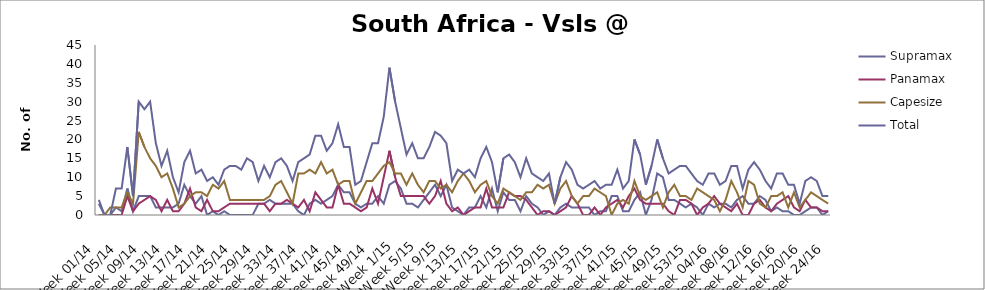
| Category | Supramax | Panamax | Capesize | Total |
|---|---|---|---|---|
| Week 01/14 | 3 | 0 | 0 | 4 |
| Week 02/14 | 0 | 0 | 0 | 0 |
| Week 03/14 | 0 | 0 | 2 | 0 |
| Week 04/14 | 2 | 0 | 2 | 7 |
| Week 05/14 | 1 | 0 | 2 | 7 |
| Week 06/14 | 7 | 5 | 6 | 18 |
| Week 07/14 | 1 | 1 | 3 | 5 |
| Week 08/14 | 5 | 3 | 22 | 30 |
| Week 09/14 | 5 | 4 | 18 | 28 |
| Week 10/14 | 5 | 5 | 15 | 30 |
| Week 11/14 | 2 | 4 | 13 | 19 |
| Week 12/14 | 2 | 1 | 10 | 13 |
| Week 13/14 | 2 | 4 | 11 | 17 |
| Week 14/14 | 2 | 1 | 7 | 10 |
| Week 15/14 | 3 | 1 | 2 | 6 |
| Week 16/14 | 8 | 3 | 3 | 14 |
| Week 17/14 | 5 | 7 | 5 | 17 |
| Week 18/14 | 3 | 2 | 6 | 11 |
| Week 19/14 | 5 | 1 | 6 | 12 |
| Week 20/14 | 0 | 4 | 5 | 9 |
| Week 21/14 | 1 | 1 | 8 | 10 |
| Week 22/14 | 0 | 1 | 7 | 8 |
| Week 23/14 | 1 | 2 | 9 | 12 |
| Week 24/14 | 0 | 3 | 4 | 13 |
| Week 25/14 | 0 | 3 | 4 | 13 |
| Week 26/14 | 0 | 3 | 4 | 12 |
| Week 27/14 | 0 | 3 | 4 | 15 |
| Week 28/14 | 0 | 3 | 4 | 14 |
| Week 29/14 | 3 | 3 | 4 | 9 |
| Week 30/14 | 3 | 3 | 4 | 13 |
| Week 31/14 | 4 | 1 | 5 | 10 |
| Week 32/14 | 3 | 3 | 8 | 14 |
| Week 33/14 | 3 | 3 | 9 | 15 |
| Week 34/14 | 3 | 4 | 6 | 13 |
| Week 35/14 | 3 | 3 | 3 | 9 |
| Week 36/14 | 1 | 2 | 11 | 14 |
| Week 37/14 | 0 | 4 | 11 | 15 |
| Week 38/14 | 3 | 1 | 12 | 16 |
| Week 39/14 | 4 | 6 | 11 | 21 |
| Week 40/14 | 3 | 4 | 14 | 21 |
| Week 41/14 | 4 | 2 | 11 | 17 |
| Week 42/14 | 5 | 2 | 12 | 19 |
| Week 43/14 | 8 | 8 | 8 | 24 |
| Week 44/14 | 6 | 3 | 9 | 18 |
| Week 45/14 | 6 | 3 | 9 | 18 |
| Week 46/14 | 3 | 2 | 3 | 8 |
| Week 47/14 | 2 | 1 | 6 | 9 |
| Week 48/14 | 3 | 2 | 9 | 14 |
| Week 49/14 | 3 | 7 | 9 | 19 |
| Week 50/14 | 5 | 3 | 11 | 19 |
| Week 51/14 | 3 | 10 | 13 | 26 |
| Week 52/14 | 8 | 17 | 14 | 39 |
| Week 1/15 | 9 | 10 | 11 | 30 |
| Week 2/15 | 7 | 5 | 11 | 23 |
| Week 3/15 | 3 | 5 | 8 | 16 |
| Week 4/15 | 3 | 5 | 11 | 19 |
| Week 5/15 | 2 | 5 | 8 | 15 |
| Week 6/15 | 4 | 5 | 6 | 15 |
| Week 7/15 | 6 | 3 | 9 | 18 |
| Week 8/15 | 8 | 5 | 9 | 22 |
| Week 9/15 | 5 | 9 | 7 | 21 |
| Week 10/15 | 8 | 3 | 8 | 19 |
| Week 11/15 | 2 | 1 | 6 | 9 |
| Week 12/15 | 1 | 2 | 9 | 12 |
| Week 13/15 | 0 | 0 | 11 | 11 |
| Week 14/15 | 2 | 1 | 9 | 12 |
| Week 15/15 | 2 | 2 | 6 | 10 |
| Week 16/15 | 5 | 2 | 8 | 15 |
| Week 17/15 | 2 | 7 | 9 | 18 |
| Week 18/15 | 7 | 2 | 5 | 14 |
| Week 19/15 | 1 | 2 | 3 | 6 |
| Week 20/15 | 6 | 2 | 7 | 15 |
| Week 21/15 | 4 | 6 | 6 | 16 |
| Week 22/15 | 4 | 5 | 5 | 14 |
| Week 23/15 | 1 | 5 | 4 | 10 |
| Week 24/15 | 5 | 4 | 6 | 15 |
| Week 25/15 | 3 | 2 | 6 | 11 |
| Week 26/15 | 2 | 0 | 8 | 10 |
| Week 27/15 | 0 | 1 | 7 | 9 |
| Week 28/15 | 1 | 1 | 8 | 11 |
| Week 29/15 | 0 | 0 | 3 | 3 |
| Week 30/15 | 2 | 1 | 7 | 10 |
| Week 31/15 | 3 | 2 | 9 | 14 |
| Week 32/15 | 2 | 5 | 5 | 12 |
| Week 33/15 | 2 | 3 | 3 | 8 |
| Week 34/15 | 2 | 0 | 5 | 7 |
| Week 35/15 | 2 | 0 | 5 | 8 |
| Week 36/15 | 0 | 2 | 7 | 9 |
| Week 37/15 | 1 | 0 | 6 | 7 |
| Week 38/15 | 1 | 2 | 5 | 8 |
| Week 39/15 | 5 | 3 | 0 | 8 |
| Week 40/15 | 5 | 4 | 3 | 12 |
| Week 41/15 | 1 | 2 | 4 | 7 |
| Week 42/15 | 1 | 5 | 3 | 9 |
| Week 43/15 | 4 | 7 | 9 | 20 |
| Week 44/15 | 6 | 4 | 5 | 16 |
| Week 45/15 | 0 | 3 | 4 | 8 |
| Week 46/15 | 4 | 3 | 5 | 13 |
| Week 47/15 | 11 | 3 | 6 | 20 |
| Week 48/15 | 10 | 3 | 2 | 15 |
| Week 49/15 | 4 | 1 | 6 | 11 |
| Week 50/15 | 4 | 0 | 8 | 12 |
| Week 51/15 | 3 | 4 | 5 | 13 |
| Week 52/15 | 2 | 4 | 5 | 13 |
| Week 53/15 | 3 | 3 | 4 | 11 |
| Week 01/16 | 2 | 0 | 7 | 9 |
| Week 02/16 | 0 | 2 | 6 | 8 |
| Week 03/16 | 3 | 3 | 5 | 11 |
| Week 04/16 | 2 | 5 | 4 | 11 |
| Week 05/16 | 3 | 3 | 1 | 8 |
| Week 06/16 | 3 | 2 | 4 | 9 |
| Week 07/16 | 2 | 1 | 9 | 13 |
| Week 08/16 | 4 | 3 | 6 | 13 |
| Week 09/16 | 5 | 0 | 2 | 7 |
| Week 10/16 | 3 | 0 | 9 | 12 |
| Week 11/16 | 3 | 3 | 8 | 14 |
| Week 12/16 | 5 | 4 | 3 | 12 |
| Week 13/16 | 4 | 2 | 2 | 9 |
| Week 14/16 | 1 | 1 | 5 | 7 |
| Week 15/16 | 2 | 3 | 5 | 11 |
| Week 16/16 | 1 | 4 | 6 | 11 |
| Week 17/16 | 1 | 5 | 2 | 8 |
| Week 18/16 | 0 | 2 | 6 | 8 |
| Week 19/16 | 0 | 1 | 2 | 3 |
| Week 20/16 | 1 | 4 | 4 | 9 |
| Week 21/16 | 2 | 2 | 6 | 10 |
| Week 22/16 | 2 | 2 | 5 | 9 |
| Week 23/16 | 0 | 1 | 4 | 5 |
| Week 24/16 | 1 | 1 | 3 | 5 |